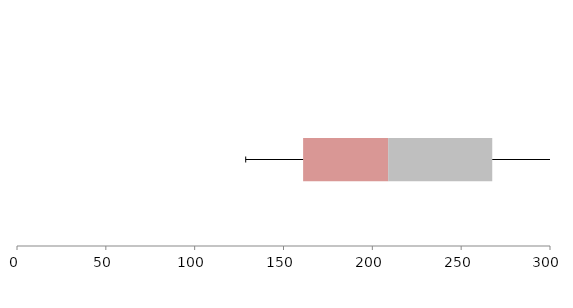
| Category | Series 1 | Series 2 | Series 3 |
|---|---|---|---|
| 0 | 161.041 | 47.869 | 58.586 |